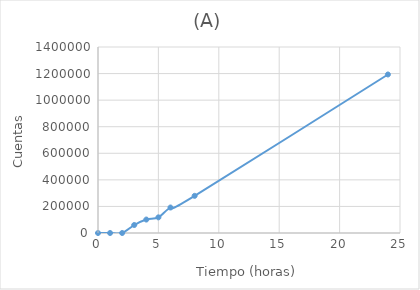
| Category | 136,8914 |
|---|---|
| 0.0 | 0 |
| 1.0 | 0 |
| 2.0 | 0 |
| 3.0 | 60193 |
| 4.0 | 101221 |
| 5.0 | 117756 |
| 6.0 | 191869 |
| 8.0 | 279783.6 |
| 24.0 | 1193188 |